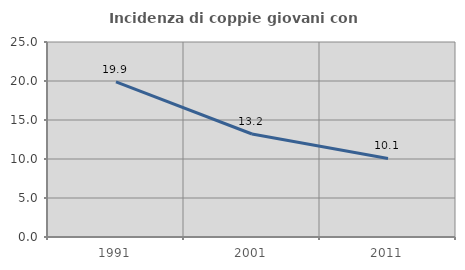
| Category | Incidenza di coppie giovani con figli |
|---|---|
| 1991.0 | 19.883 |
| 2001.0 | 13.204 |
| 2011.0 | 10.074 |